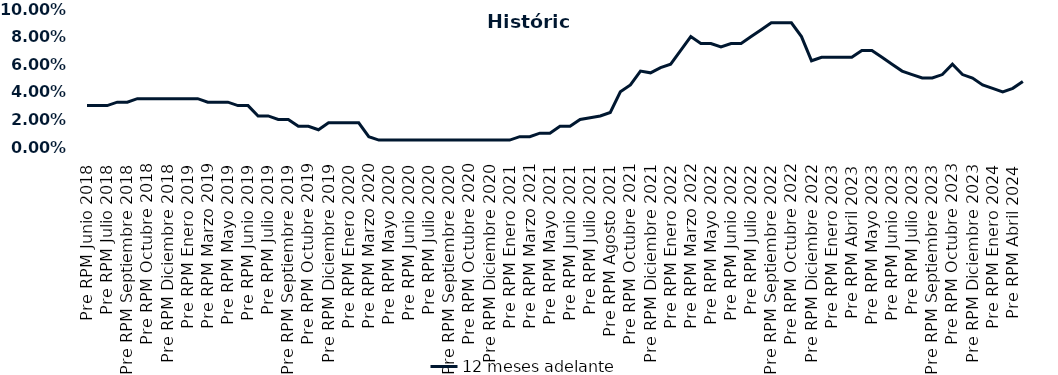
| Category | 12 meses adelante  |
|---|---|
| Pre RPM Junio 2018 | 0.03 |
| Post RPM Junio 2018 | 0.03 |
| Pre RPM Julio 2018 | 0.03 |
| Post RPM Julio 2018 | 0.032 |
| Pre RPM Septiembre 2018 | 0.032 |
| Post RPM Septiembre 2018 | 0.035 |
| Pre RPM Octubre 2018 | 0.035 |
| Post RPM Octubre 2018 | 0.035 |
| Pre RPM Diciembre 2018 | 0.035 |
| Post RPM Diciembre 2018 | 0.035 |
| Pre RPM Enero 2019 | 0.035 |
| Post RPM Enero 2019 | 0.035 |
| Pre RPM Marzo 2019 | 0.032 |
| Post RPM Marzo 2019 | 0.032 |
| Pre RPM Mayo 2019 | 0.032 |
| Post RPM Mayo 2019 | 0.03 |
| Pre RPM Junio 2019 | 0.03 |
| Post RPM Junio 2019 | 0.022 |
| Pre RPM Julio 2019 | 0.022 |
| Post RPM Julio 2019 | 0.02 |
| Pre RPM Septiembre 2019 | 0.02 |
| Post RPM Septiembre 2019 | 0.015 |
| Pre RPM Octubre 2019 | 0.015 |
| Post RPM Octubre 2019 | 0.012 |
| Pre RPM Diciembre 2019 | 0.018 |
| Post RPM Diciembre 2019 | 0.018 |
| Pre RPM Enero 2020 | 0.018 |
| Post RPM Enero 2020 | 0.018 |
| Pre RPM Marzo 2020 | 0.008 |
| Post RPM Marzo 2020 | 0.005 |
| Pre RPM Mayo 2020 | 0.005 |
| Post RPM Mayo 2020 | 0.005 |
| Pre RPM Junio 2020 | 0.005 |
| Post RPM Junio 2020 | 0.005 |
| Pre RPM Julio 2020 | 0.005 |
| Post RPM Julio 2020 | 0.005 |
| Pre RPM Septiembre 2020 | 0.005 |
| Post RPM Septiembre 2020 | 0.005 |
| Pre RPM Octubre 2020 | 0.005 |
| Post RPM Octubre 2020 | 0.005 |
| Pre RPM Diciembre 2020 | 0.005 |
| Post RPM Diciembre 2020 | 0.005 |
| Pre RPM Enero 2021 | 0.005 |
| Post RPM Enero 2021 | 0.008 |
| Pre RPM Marzo 2021 | 0.008 |
| Post RPM Marzo 2021 | 0.01 |
| Pre RPM Mayo 2021 | 0.01 |
| Post RPM Mayo 2021 | 0.015 |
| Pre RPM Junio 2021 | 0.015 |
| Post RPM Junio 2021 | 0.02 |
| Pre RPM Julio 2021 | 0.021 |
| Post RPM Julio 2021 | 0.022 |
| Pre RPM Agosto 2021 | 0.025 |
| Post RPM Agosto 2021 | 0.04 |
| Pre RPM Octubre 2021 | 0.045 |
| Post RPM Octubre 2021 | 0.055 |
| Pre RPM Diciembre 2021 | 0.054 |
| Post RPM Diciembre 2021 | 0.058 |
| Pre RPM Enero 2022 | 0.06 |
| Post RPM Enero 2022 | 0.07 |
| Pre RPM Marzo 2022 | 0.08 |
| Post RPM Marzo 2022 | 0.075 |
| Pre RPM Mayo 2022 | 0.075 |
| Post RPM Mayo 2022 | 0.072 |
| Pre RPM Junio 2022 | 0.075 |
| Post RPM Junio 2022 | 0.075 |
| Pre RPM Julio 2022 | 0.08 |
| Post RPM Julio 2022 | 0.085 |
| Pre RPM Septiembre 2022 | 0.09 |
| Post RPM Septiembre 2022 | 0.09 |
| Pre RPM Octubre 2022 | 0.09 |
| Post RPM Octubre 2022 | 0.08 |
| Pre RPM Diciembre 2022 | 0.062 |
| Post RPM Diciembre 2022 | 0.065 |
| Pre RPM Enero 2023 | 0.065 |
| Post RPM Enero 2023 | 0.065 |
| Pre RPM Abril 2023 | 0.065 |
| Post RPM Abril 2023 | 0.07 |
| Pre RPM Mayo 2023 | 0.07 |
| Post RPM Mayo 2023 | 0.065 |
| Pre RPM Junio 2023 | 0.06 |
| Post RPM Junio 2023 | 0.055 |
| Pre RPM Julio 2023 | 0.052 |
| Post RPM Julio 2023 | 0.05 |
| Pre RPM Septiembre 2023 | 0.05 |
| Post RPM Septiembre 2023 | 0.052 |
| Pre RPM Octubre 2023 | 0.06 |
| Post RPM Octubre 2023 | 0.052 |
| Pre RPM Diciembre 2023 | 0.05 |
| Post RPM Diciembre 2023 | 0.045 |
| Pre RPM Enero 2024 | 0.042 |
| Post RPM Enero 2024 | 0.04 |
| Pre RPM Abril 2024 | 0.042 |
| Post RPM Abril 2024 | 0.048 |